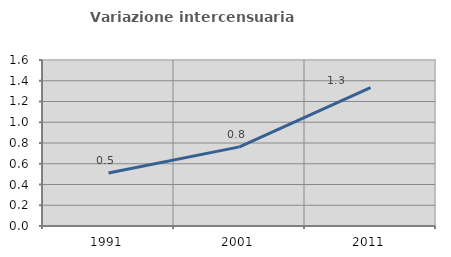
| Category | Variazione intercensuaria annua |
|---|---|
| 1991.0 | 0.511 |
| 2001.0 | 0.763 |
| 2011.0 | 1.335 |